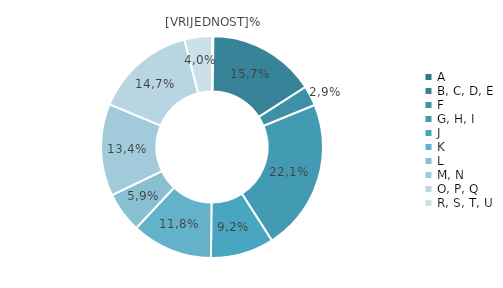
| Category | Zagreb |
|---|---|
| A | 0.2 |
| B, C, D, E | 15.7 |
| F | 2.9 |
| G, H, I | 22.1 |
| J | 9.2 |
| K | 11.8 |
| L | 5.9 |
| M, N | 13.4 |
| O, P, Q | 14.7 |
| R, S, T, U | 4 |